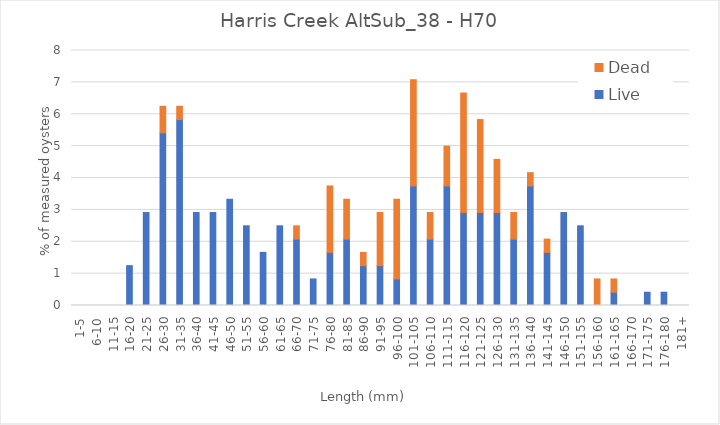
| Category | Live | Dead |
|---|---|---|
| 1-5 | 0 | 0 |
| 6-10 | 0 | 0 |
| 11-15 | 0 | 0 |
| 16-20 | 1.25 | 0 |
| 21-25 | 2.917 | 0 |
| 26-30 | 5.417 | 0.833 |
| 31-35 | 5.833 | 0.417 |
| 36-40 | 2.917 | 0 |
| 41-45 | 2.917 | 0 |
| 46-50 | 3.333 | 0 |
| 51-55 | 2.5 | 0 |
| 56-60 | 1.667 | 0 |
| 61-65 | 2.5 | 0 |
| 66-70 | 2.083 | 0.417 |
| 71-75 | 0.833 | 0 |
| 76-80 | 1.667 | 2.083 |
| 81-85 | 2.083 | 1.25 |
| 86-90 | 1.25 | 0.417 |
| 91-95 | 1.25 | 1.667 |
| 96-100 | 0.833 | 2.5 |
| 101-105 | 3.75 | 3.333 |
| 106-110 | 2.083 | 0.833 |
| 111-115 | 3.75 | 1.25 |
| 116-120 | 2.917 | 3.75 |
| 121-125 | 2.917 | 2.917 |
| 126-130 | 2.917 | 1.667 |
| 131-135 | 2.083 | 0.833 |
| 136-140 | 3.75 | 0.417 |
| 141-145 | 1.667 | 0.417 |
| 146-150 | 2.917 | 0 |
| 151-155 | 2.5 | 0 |
| 156-160 | 0 | 0.833 |
| 161-165 | 0.417 | 0.417 |
| 166-170 | 0 | 0 |
| 171-175 | 0.417 | 0 |
| 176-180 | 0.417 | 0 |
| 181+ | 0 | 0 |